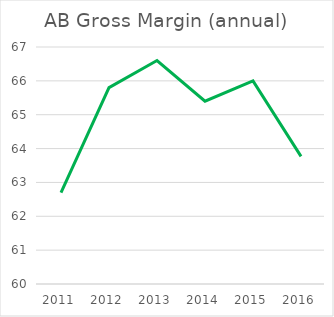
| Category | Series 0 |
|---|---|
| 2011.0 | 62.7 |
| 2012.0 | 65.8 |
| 2013.0 | 66.6 |
| 2014.0 | 65.4 |
| 2015.0 | 66 |
| 2016.0 | 63.77 |